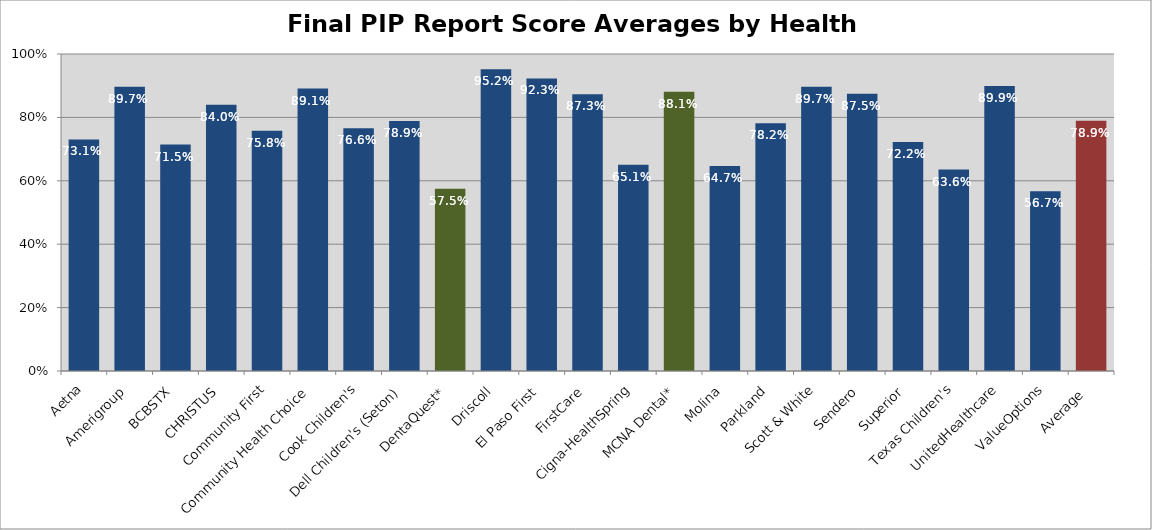
| Category | Final PIP Report
Averages |
|---|---|
| Aetna | 0.73 |
| Amerigroup | 0.897 |
| BCBSTX | 0.714 |
| CHRISTUS | 0.84 |
| Community First | 0.758 |
| Community Health Choice | 0.891 |
| Cook Children's | 0.766 |
| Dell Children's (Seton) | 0.789 |
| DentaQuest* | 0.575 |
| Driscoll | 0.952 |
| El Paso First | 0.923 |
| FirstCare | 0.873 |
| Cigna-HealthSpring | 0.651 |
| MCNA Dental* | 0.881 |
| Molina | 0.647 |
| Parkland | 0.782 |
| Scott & White | 0.897 |
| Sendero | 0.875 |
| Superior | 0.722 |
| Texas Children's | 0.636 |
| UnitedHealthcare | 0.899 |
| ValueOptions | 0.567 |
| Average  | 0.789 |